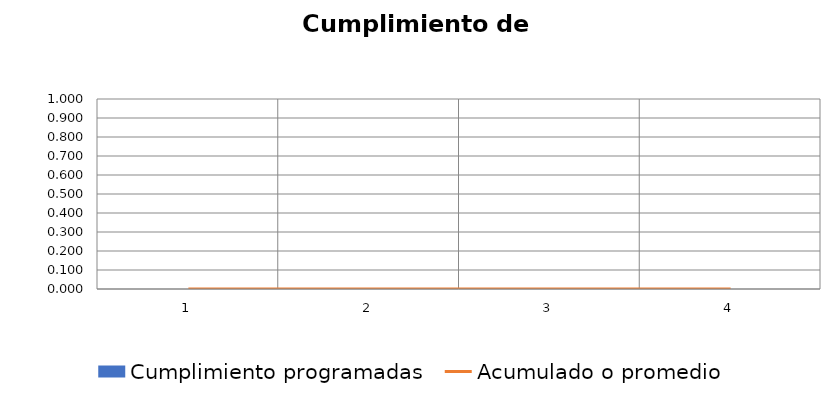
| Category | Cumplimiento programadas |
|---|---|
| 0 | 0 |
| 1 | 0 |
| 2 | 0 |
| 3 | 0 |